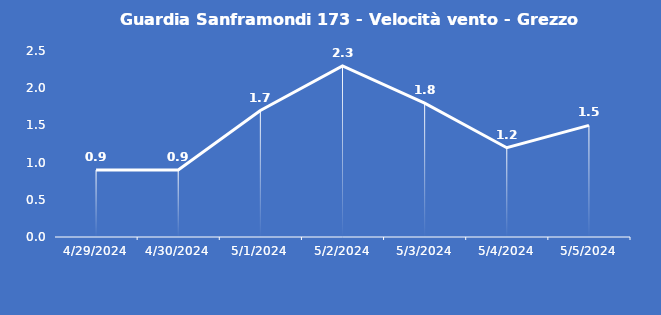
| Category | Guardia Sanframondi 173 - Velocità vento - Grezzo (m/s) |
|---|---|
| 4/29/24 | 0.9 |
| 4/30/24 | 0.9 |
| 5/1/24 | 1.7 |
| 5/2/24 | 2.3 |
| 5/3/24 | 1.8 |
| 5/4/24 | 1.2 |
| 5/5/24 | 1.5 |